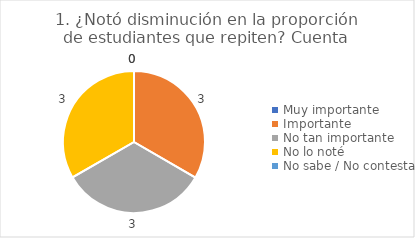
| Category | 1. ¿Notó disminución en la proporción de estudiantes que repiten? |
|---|---|
| Muy importante  | 0 |
| Importante  | 0.333 |
| No tan importante  | 0.333 |
| No lo noté  | 0.333 |
| No sabe / No contesta | 0 |